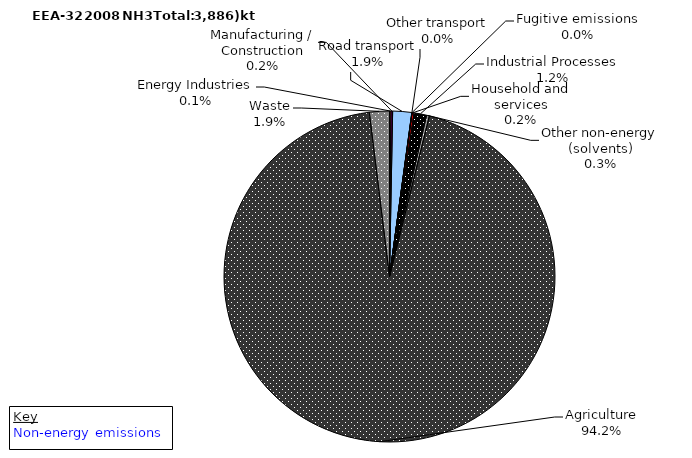
| Category | Series 0 |
|---|---|
| Energy Industries | 5.367 |
| Manufacturing / Construction | 6.418 |
| Road transport | 71.945 |
| Other transport | 0.595 |
| Fugitive emissions | 0.745 |
| Household and services | 7.17 |
| Industrial Processes | 47.602 |
| Other non-energy (solvents) | 10.633 |
| Agriculture | 3660.542 |
| Waste | 75.65 |